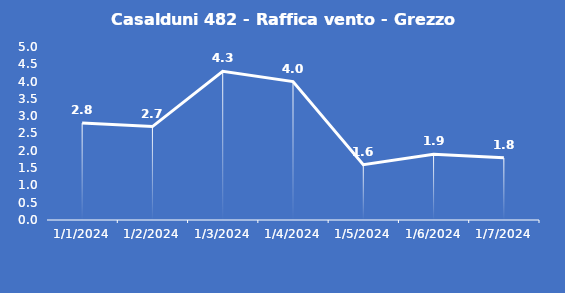
| Category | Casalduni 482 - Raffica vento - Grezzo (m/s) |
|---|---|
| 1/1/24 | 2.8 |
| 1/2/24 | 2.7 |
| 1/3/24 | 4.3 |
| 1/4/24 | 4 |
| 1/5/24 | 1.6 |
| 1/6/24 | 1.9 |
| 1/7/24 | 1.8 |